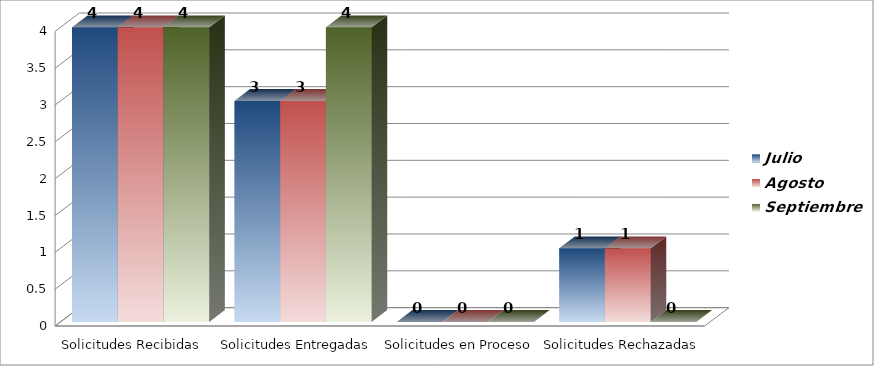
| Category | Julio  | Agosto | Septiembre  |
|---|---|---|---|
| Solicitudes Recibidas  | 4 | 4 | 4 |
| Solicitudes Entregadas | 3 | 3 | 4 |
| Solicitudes en Proceso | 0 | 0 | 0 |
| Solicitudes Rechazadas | 1 | 1 | 0 |